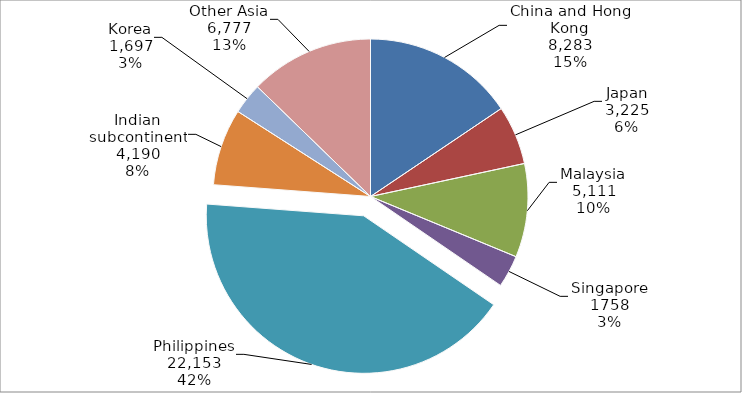
| Category | Column1 |
|---|---|
| China and Hong Kong | 8283 |
| Japan | 3225 |
| Malaysia | 5111 |
| Singapore | 1758 |
| Philippines | 22153 |
| Indian subcontinent | 4190 |
| Korea | 1697 |
| Other Asia | 6777 |